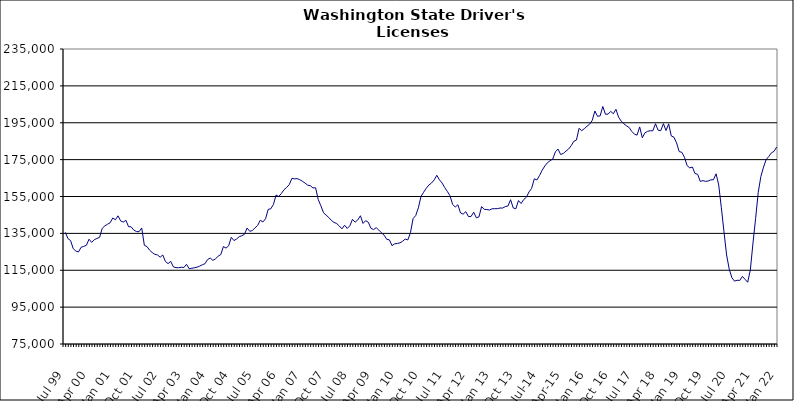
| Category | Series 0 |
|---|---|
| Jul 99 | 135560 |
| Aug 99 | 132182 |
| Sep 99 | 131104 |
| Oct 99 | 126694 |
| Nov 99 | 125425 |
| Dec 99 | 124927 |
| Jan 00 | 127499 |
| Feb 00 | 127927 |
| Mar 00 | 128547 |
| Apr 00 | 131834 |
| May 00 | 130120 |
| Jun 00 | 131595 |
| Jul 00 | 132236 |
| Aug 00 | 132819 |
| Sep 00 | 137711 |
| Oct 00 | 139063 |
| Nov 00 | 139952 |
| Dec 00 | 140732 |
| Jan 01 | 143338 |
| Feb 01 | 142359 |
| Mar 01 | 144523 |
| Apr 01 | 141758 |
| May 01 | 141135 |
| Jun 01 | 142064 |
| Jul 01 | 138646 |
| Aug 01 | 138530 |
| Sep 01 | 136784 |
| Oct 01 | 135996 |
| Nov 01 | 135917 |
| Dec 01 | 137940 |
| Jan 02 | 128531 |
| Feb 02 | 127848 |
| Mar 02 | 125876 |
| Apr 02 | 124595 |
| May 02 | 123660 |
| Jun 02 | 123282 |
| Jul 02 | 122089 |
| Aug 02 | 123279 |
| Sep 02 | 119727 |
| Oct 02 | 118588 |
| Nov 02 | 119854 |
| Dec 02 | 116851 |
| Jan 03 | 116407 |
| Feb 03 | 116382 |
| Mar 03 | 116648 |
| Apr 03 | 116471 |
| May 03 | 118231 |
| Jun 03 | 115831 |
| Jul 03 | 116082 |
| Aug 03 | 116341 |
| Sep 03 | 116653 |
| Oct 03 | 117212 |
| Nov 03 | 117962 |
| Dec 03 | 118542 |
| Jan 04 | 120817 |
| Feb 04 | 121617 |
| Mar 04 | 120369 |
| Apr 04 | 121200 |
| May 04 | 122609 |
| Jun 04 | 123484 |
| Jul 04 | 127844 |
| Aug 04 | 127025 |
| Sep 04 | 128273 |
| Oct 04 | 132853 |
| Nov 04 | 131106 |
| Dec 04 | 131935 |
| Jan 05 | 133205 |
| Feb 05 | 133736 |
| Mar 05 | 134528 |
| Apr 05 | 137889 |
| May 05 | 136130 |
| Jun 05 | 136523 |
| Jul 05 | 137997 |
| Aug 05 | 139294 |
| Sep 05 | 142140 |
| Oct 05 | 141192 |
| Nov 05 | 142937 |
| Dec 05 | 148013 |
| Jan 06 | 148341 |
| Feb 06 | 150744 |
| Mar 06 | 155794 |
| Apr 06 | 154984 |
| May 06 | 156651 |
| Jun 06 | 158638 |
| Jul 06 | 159911 |
| Aug 06 | 161445 |
| Sep 06 | 164852 |
| Oct 06 | 164570 |
| Nov 06 | 164679 |
| Dec 06 | 164127 |
| Jan 07 | 163271 |
| Feb 07 | 162273 |
| Mar 07 | 161140 |
| Apr 07 | 160860 |
| May 07 | 159633 |
| Jun 07 | 159724 |
| Jul 07 | 153303 |
| Aug 07 | 149939 |
| Sep 07 | 146172 |
| Oct 07 | 144876 |
| Nov 07 | 143613 |
| Dec 07 | 142022 |
| Jan 08 | 140909 |
| Feb 08 | 140368 |
| Mar 08 | 138998 |
| Apr 08 | 137471 |
| May 08 | 139453 |
| Jun 08 | 137680 |
| Jul 08 | 139120 |
| Aug 08 | 142612 |
| Sep-08 | 141071 |
| Oct 08 | 142313 |
| Nov 08 | 144556 |
| Dec 08 | 140394 |
| Jan 09 | 141903 |
| Feb 09 | 141036 |
| Mar 09 | 137751 |
| Apr 09 | 137060 |
| May 09 | 138101 |
| Jun 09 | 136739 |
| Jul 09 | 135317 |
| Aug 09 | 134020 |
| Sep 09 | 131756 |
| Oct 09 | 131488 |
| Nov 09 | 128370 |
| Dec 09 | 129323 |
| Jan 10 | 129531 |
| Feb 10 | 129848 |
| Mar 10 | 130654 |
| Apr 10 | 131929 |
| May 10 | 131429 |
| Jun 10 | 135357 |
| Jul 10 | 143032 |
| Aug 10 | 144686 |
| Sep 10 | 148856 |
| Oct 10 | 155042 |
| Nov 10 | 157328 |
| Dec 10 | 159501 |
| Jan 11 | 161221 |
| Feb 11 | 162312 |
| Mar 11 | 163996 |
| Apr 11 | 166495 |
| May 11 | 164040 |
| Jun 11 | 162324 |
| Jul 11 | 159862 |
| Aug 11 | 157738 |
| Sep 11 | 155430 |
| Oct 11 | 150762 |
| Nov 11 | 149255 |
| Dec 11 | 150533 |
| Jan 12 | 146068 |
| Feb 12 | 145446 |
| Mar 12 | 146788 |
| Apr 12 | 144110 |
| May 12 | 144162 |
| Jun 12 | 146482 |
| Jul 12 | 143445 |
| Aug 12 | 143950 |
| Sep 12 | 149520 |
| Oct 12 | 148033 |
| Nov 12 | 147926 |
| Dec 12 | 147674 |
| Jan 13 | 148360 |
| Feb-13 | 148388 |
| Mar-13 | 148414 |
| Apr 13 | 148749 |
| May 13 | 148735 |
| Jun-13 | 149521 |
| Jul 13 | 149837 |
| Aug 13 | 153252 |
| Sep 13 | 148803 |
| Oct 13 | 148315 |
| Nov 13 | 152804 |
| Dec 13 | 151209 |
| Jan 14 | 153357 |
| Feb-14 | 154608 |
| Mar 14 | 157479 |
| Apr 14 | 159441 |
| May 14 | 164591 |
| Jun 14 | 163995 |
| Jul-14 | 166411 |
| Aug-14 | 169272 |
| Sep 14 | 171565 |
| Oct 14 | 173335 |
| Nov 14 | 174406 |
| Dec 14 | 175302 |
| Jan 15 | 179204 |
| Feb 15 | 180737 |
| Mar 15 | 177810 |
| Apr-15 | 178331 |
| May 15 | 179601 |
| Jun-15 | 180729 |
| Jul 15 | 182540 |
| Aug 15 | 184924 |
| Sep 15 | 185620 |
| Oct 15 | 192002 |
| Nov 15 | 190681 |
| Dec 15 | 191795 |
| Jan 16 | 193132 |
| Feb 16 | 194206 |
| Mar 16 | 196319 |
| Apr 16 | 201373 |
| May 16 | 198500 |
| Jun 16 | 198743 |
| Jul 16 | 203841 |
| Aug 16 | 199630 |
| Sep 16 | 199655 |
| Oct 16 | 201181 |
| Nov 16 | 199888 |
| Dec 16 | 202304 |
| Jan 17 | 197977 |
| Feb 17 | 195889 |
| Mar 17 | 194438 |
| Apr 17 | 193335 |
| May 17 | 192430 |
| Jun 17 | 190298 |
| Jul 17 | 188832 |
| Aug 17 | 188264 |
| Sep 17 | 192738 |
| Oct 17 | 186856 |
| Nov 17 | 189537 |
| Dec 17 | 190341 |
| Jan 18 | 190670 |
| Feb 18 | 190645 |
| Mar 18 | 194476 |
| Apr 18 | 190971 |
| May 18 | 190707 |
| Jun 18 | 194516 |
| Jul 18 | 190783 |
| Aug 18 | 194390 |
| Sep 18 | 187831 |
| Oct 18 | 187188 |
| Nov 18 | 184054 |
| Dec 18 | 179347 |
| Jan 19 | 178958 |
| Feb 19 | 176289 |
| Mar 19 | 171747 |
| Apr 19 | 170532 |
| May 19 | 170967 |
| Jun 19 | 167444 |
| Jul 19 | 167059 |
| Aug 19 | 163194 |
| Sep 19 | 163599 |
| Oct 19 | 163212 |
| Nov 19 | 163388 |
| Dec 19 | 164024 |
| Jan 20 | 164114 |
| Feb 20 | 167320 |
| Mar 20 | 161221 |
| Apr 20 | 148866 |
| May 20 | 135821 |
| Jun 20 | 123252 |
| Jul 20 | 115526 |
| Aug 20 | 110940 |
| Sep 20 | 109099 |
| Oct 20 | 109566 |
| Nov 20 | 109488 |
| Dec 20 | 111658 |
| Jan 21 | 110070 |
| Feb 21 | 108491 |
| Mar 21 | 115176 |
| Apr 21 | 129726 |
| May 21 | 143052 |
| Jun 21 | 157253 |
| Jul 21 | 165832 |
| Aug 21 | 170937 |
| Sep 21 | 175042 |
| Oct 21 | 176696 |
| Nov 21 | 178677 |
| Dec 21 | 179501 |
| Jan 22 | 181825 |